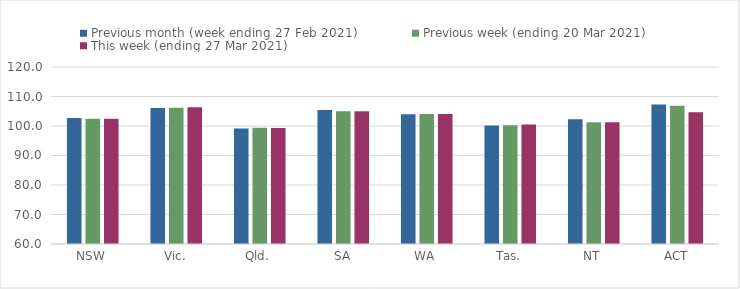
| Category | Previous month (week ending 27 Feb 2021) | Previous week (ending 20 Mar 2021) | This week (ending 27 Mar 2021) |
|---|---|---|---|
| NSW | 102.7 | 102.45 | 102.45 |
| Vic. | 106.06 | 106.18 | 106.37 |
| Qld. | 99.17 | 99.42 | 99.33 |
| SA | 105.46 | 104.98 | 104.98 |
| WA | 103.95 | 104.07 | 104.07 |
| Tas. | 100.15 | 100.26 | 100.54 |
| NT | 102.33 | 101.3 | 101.3 |
| ACT | 107.32 | 106.85 | 104.66 |